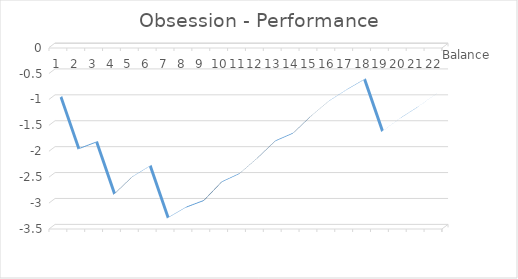
| Category | Balance |
|---|---|
| 0 | -1 |
| 1 | -2 |
| 2 | -1.87 |
| 3 | -2.87 |
| 4 | -2.54 |
| 5 | -2.33 |
| 6 | -3.33 |
| 7 | -3.13 |
| 8 | -3 |
| 9 | -2.64 |
| 10 | -2.48 |
| 11 | -2.18 |
| 12 | -1.85 |
| 13 | -1.7 |
| 14 | -1.37 |
| 15 | -1.08 |
| 16 | -0.86 |
| 17 | -0.66 |
| 18 | -1.66 |
| 19 | -1.41 |
| 20 | -1.19 |
| 21 | -0.94 |